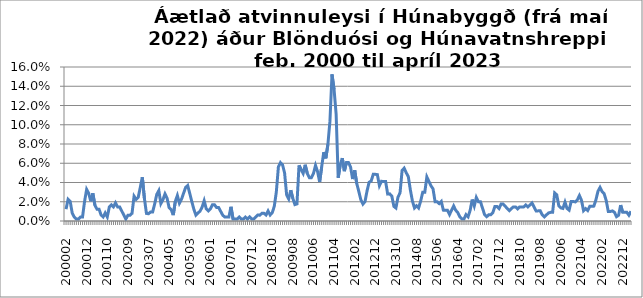
| Category | Series 0 |
|---|---|
| 200002 | 0.012 |
| 200003 | 0.023 |
| 200004 | 0.02 |
| 200005 | 0.008 |
| 200006 | 0.004 |
| 200007 | 0.002 |
| 200008 | 0.002 |
| 200009 | 0.004 |
| 200010 | 0.004 |
| 200011 | 0.02 |
| 200012 | 0.033 |
| 200101 | 0.029 |
| 200102 | 0.021 |
| 200103 | 0.029 |
| 200104 | 0.016 |
| 200105 | 0.012 |
| 200106 | 0.012 |
| 200107 | 0.006 |
| 200108 | 0.004 |
| 200109 | 0.008 |
| 200110 | 0.004 |
| 200111 | 0.015 |
| 200112 | 0.017 |
| 200201 | 0.015 |
| 200202 | 0.019 |
| 200203 | 0.015 |
| 200204 | 0.015 |
| 200205 | 0.01 |
| 200206 | 0.006 |
| 200208 | 0.002 |
| 200209 | 0.006 |
| 200210 | 0.006 |
| 200211 | 0.008 |
| 200212 | 0.026 |
| 200301 | 0.022 |
| 200302 | 0.024 |
| 200303 | 0.035 |
| 200304 | 0.045 |
| 200305 | 0.024 |
| 200306 | 0.008 |
| 200307 | 0.008 |
| 200308 | 0.009 |
| 200309 | 0.009 |
| 200310 | 0.018 |
| 200311 | 0.028 |
| 200312 | 0.032 |
| 200401 | 0.018 |
| 200402 | 0.022 |
| 200403 | 0.028 |
| 200404 | 0.024 |
| 200405 | 0.014 |
| 200406 | 0.012 |
| 200407 | 0.006 |
| 200408 | 0.02 |
| 200409 | 0.026 |
| 200410 | 0.018 |
| 200411 | 0.023 |
| 200412 | 0.029 |
| 200501 | 0.035 |
| 200502 | 0.037 |
| 200503 | 0.029 |
| 200504 | 0.02 |
| 200505 | 0.012 |
| 200506 | 0.006 |
| 200507 | 0.008 |
| 200508 | 0.01 |
| 200509 | 0.014 |
| 200510 | 0.021 |
| 200511 | 0.013 |
| 200512 | 0.011 |
| 200601 | 0.013 |
| 200602 | 0.017 |
| 200603 | 0.017 |
| 200604 | 0.014 |
| 200605 | 0.014 |
| 200606 | 0.01 |
| 200607 | 0.006 |
| 200608 | 0.004 |
| 200609 | 0.004 |
| 200612 | 0.004 |
| 200701 | 0.015 |
| 200702 | 0.002 |
| 200703 | 0.002 |
| 200704 | 0.002 |
| 200705 | 0.004 |
| 200706 | 0.002 |
| 200707 | 0.002 |
| 200708 | 0.004 |
| 200709 | 0.002 |
| 200711 | 0.004 |
| 200712 | 0.002 |
| 200801 | 0.002 |
| 200802 | 0.004 |
| 200803 | 0.006 |
| 200804 | 0.006 |
| 200805 | 0.008 |
| 200806 | 0.008 |
| 200807 | 0.006 |
| 200808 | 0.01 |
| 200809 | 0.006 |
| 200810 | 0.009 |
| 200811 | 0.015 |
| 200812 | 0.03 |
| 200901 | 0.056 |
| 200902 | 0.061 |
| 200903 | 0.058 |
| 200904 | 0.05 |
| 200905 | 0.027 |
| 200906 | 0.023 |
| 200907 | 0.032 |
| 200908 | 0.023 |
| 200909 | 0.017 |
| 200910 | 0.018 |
| 200911 | 0.058 |
| 200912 | 0.053 |
| 201001 | 0.049 |
| 201002 | 0.058 |
| 201003 | 0.049 |
| 201004 | 0.045 |
| 201005 | 0.045 |
| 201006 | 0.049 |
| 201007 | 0.058 |
| 201008 | 0.051 |
| 201009 | 0.041 |
| 201010 | 0.056 |
| 201011 | 0.072 |
| 201012 | 0.065 |
| 201101 | 0.079 |
| 201102 | 0.104 |
| 201103 | 0.152 |
| 201104 | 0.137 |
| 201105 | 0.111 |
| 201106 | 0.045 |
| 201107 | 0.059 |
| 201108 | 0.065 |
| 201109 | 0.052 |
| 201110 | 0.061 |
| 201111 | 0.061 |
| 201112 | 0.056 |
| 201201 | 0.044 |
| 201202 | 0.053 |
| 201203 | 0.039 |
| 201204 | 0.031 |
| 201205 | 0.022 |
| 201206 | 0.018 |
| 201207 | 0.02 |
| 201208 | 0.031 |
| 201209 | 0.04 |
| 201210 | 0.042 |
| 201211 | 0.048 |
| 201212 | 0.048 |
| 201301 | 0.048 |
| 201302 | 0.037 |
| 201303 | 0.041 |
| 201304 | 0.041 |
| 201305 | 0.041 |
| 201306 | 0.028 |
| 201307 | 0.028 |
| 201308 | 0.026 |
| 201309 | 0.015 |
| 201310 | 0.014 |
| 201311 | 0.025 |
| 201312 | 0.029 |
| 201401 | 0.053 |
| 201402 | 0.055 |
| 201403 | 0.05 |
| 201404 | 0.046 |
| 201405 | 0.032 |
| 201406 | 0.021 |
| 201407 | 0.014 |
| 201408 | 0.016 |
| 201409 | 0.014 |
| 201410 | 0.021 |
| 201411 | 0.03 |
| 201412 | 0.03 |
| 201501 | 0.046 |
| 201502 | 0.041 |
| 201503 | 0.037 |
| 201504 | 0.033 |
| 201505 | 0.02 |
| 201506 | 0.02 |
| 201507 | 0.018 |
| 201508 | 0.02 |
| 201509 | 0.011 |
| 201510 | 0.011 |
| 201511 | 0.011 |
| 201512 | 0.007 |
| 201601 | 0.011 |
| 201602 | 0.016 |
| 201603 | 0.011 |
| 201604 | 0.009 |
| 201605 | 0.004 |
| 201606 | 0.002 |
| 201607 | 0.002 |
| 201608 | 0.007 |
| 201609 | 0.004 |
| 201610 | 0.011 |
| 201611 | 0.022 |
| 201612 | 0.016 |
| 201701 | 0.024 |
| 201702 | 0.02 |
| 201703 | 0.02 |
| 201704 | 0.013 |
| 201705 | 0.007 |
| 201706 | 0.004 |
| 201707 | 0.006 |
| 201708 | 0.006 |
| 201709 | 0.009 |
| 201710 | 0.015 |
| 201711 | 0.015 |
| 201712 | 0.013 |
| 201801 | 0.018 |
| 201802 | 0.018 |
| 201803 | 0.015 |
| 201804 | 0.013 |
| 201805 | 0.011 |
| 201806 | 0.013 |
| 201807 | 0.015 |
| 201808 | 0.015 |
| 201809 | 0.013 |
| 201810 | 0.015 |
| 201811 | 0.015 |
| 201812 | 0.015 |
| 201901 | 0.017 |
| 201902 | 0.015 |
| 201903 | 0.017 |
| 201904 | 0.019 |
| 201905 | 0.015 |
| 201906 | 0.01 |
| 201907 | 0.011 |
| 201908 | 0.011 |
| 201909 | 0.006 |
| 201910 | 0.004 |
| 201911 | 0.006 |
| 201912 | 0.008 |
| 202001 | 0.009 |
| 202002 | 0.009 |
| 202003 | 0.029 |
| 202004 | 0.027 |
| 202005 | 0.016 |
| 202006 | 0.014 |
| 202007 | 0.013 |
| 202008 | 0.02 |
| 202009 | 0.013 |
| 202010 | 0.011 |
| 202011 | 0.02 |
| 202012 | 0.02 |
| 202101 | 0.02 |
| 202102 | 0.022 |
| 202103 | 0.026 |
| 202104 | 0.022 |
| 202105 | 0.011 |
| 202106 | 0.013 |
| 202107 | 0.011 |
| 202108 | 0.015 |
| 202109 | 0.015 |
| 202110 | 0.015 |
| 202111 | 0.022 |
| 202112 | 0.031 |
| 202201 | 0.035 |
| 202202 | 0.031 |
| 202203 | 0.028 |
| 202204 | 0.021 |
| 202205 *** | 0.01 |
| 202206 | 0.01 |
| 202207 | 0.01 |
| 202208 | 0.009 |
| 202209 | 0.004 |
| 202210 | 0.006 |
| 202211 | 0.016 |
| 202212 | 0.009 |
| 202301 | 0.009 |
| 202302 | 0.009 |
| 202303 | 0.006 |
| 202304 | 0.01 |